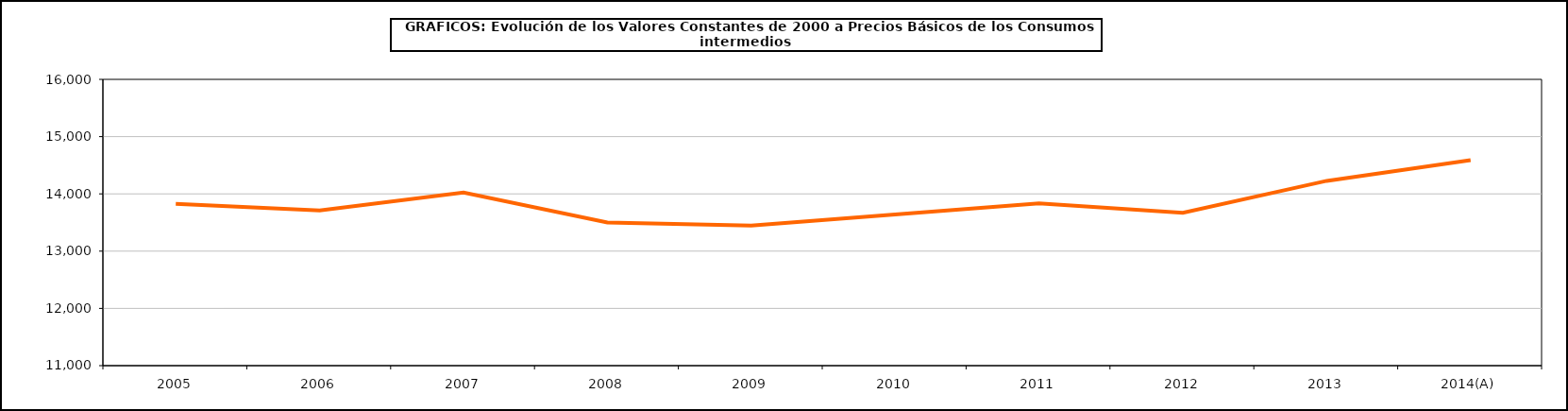
| Category | Total consumos intermedios |
|---|---|
| 2005 | 13826.406 |
| 2006 | 13712.1 |
| 2007 | 14024.9 |
| 2008 | 13501.9 |
| 2009 | 13446.9 |
| 2010 | 13642 |
| 2011 | 13835.8 |
| 2012 | 13669.3 |
| 2013 | 14227.7 |
| 2014(A) | 14588.3 |